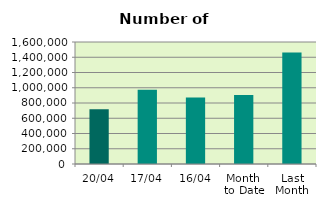
| Category | Series 0 |
|---|---|
| 20/04 | 719506 |
| 17/04 | 972234 |
| 16/04 | 871946 |
| Month 
to Date | 905608.167 |
| Last
Month | 1462822.818 |